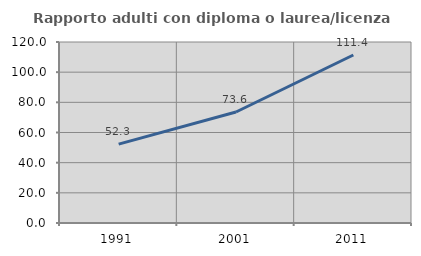
| Category | Rapporto adulti con diploma o laurea/licenza media  |
|---|---|
| 1991.0 | 52.304 |
| 2001.0 | 73.585 |
| 2011.0 | 111.397 |